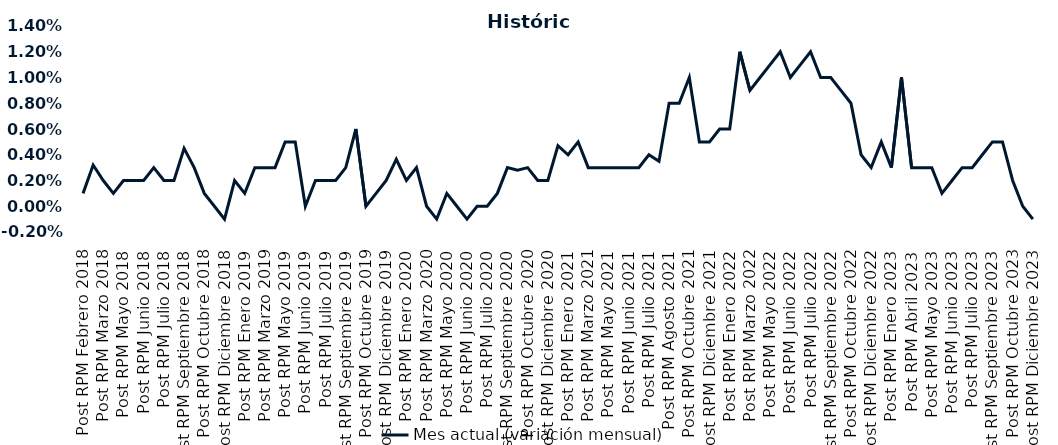
| Category | Mes actual (variación mensual)  |
|---|---|
| Post RPM Febrero 2018 | 0.001 |
| Pre RPM Marzo 2018 | 0.003 |
| Post RPM Marzo 2018 | 0.002 |
| Pre RPM Mayo 2018 | 0.001 |
| Post RPM Mayo 2018 | 0.002 |
| Pre RPM Junio 2018 | 0.002 |
| Post RPM Junio 2018 | 0.002 |
| Pre RPM Julio 2018 | 0.003 |
| Post RPM Julio 2018 | 0.002 |
| Pre RPM Septiembre 2018 | 0.002 |
| Post RPM Septiembre 2018 | 0.004 |
| Pre RPM Octubre 2018 | 0.003 |
| Post RPM Octubre 2018 | 0.001 |
| Pre RPM Diciembre 2018 | 0 |
| Post RPM Diciembre 2018 | -0.001 |
| Pre RPM Enero 2019 | 0.002 |
| Post RPM Enero 2019 | 0.001 |
| Pre RPM Marzo 2019 | 0.003 |
| Post RPM Marzo 2019 | 0.003 |
| Pre RPM Mayo 2019 | 0.003 |
| Post RPM Mayo 2019 | 0.005 |
| Pre RPM Junio 2019 | 0.005 |
| Post RPM Junio 2019 | 0 |
| Pre RPM Julio 2019 | 0.002 |
| Post RPM Julio 2019 | 0.002 |
| Pre RPM Septiembre 2019 | 0.002 |
| Post RPM Septiembre 2019 | 0.003 |
| Pre RPM Octubre 2019 | 0.006 |
| Post RPM Octubre 2019 | 0 |
| Pre RPM Diciembre 2019 | 0.001 |
| Post RPM Diciembre 2019 | 0.002 |
| Pre RPM Enero 2020 | 0.004 |
| Post RPM Enero 2020 | 0.002 |
| Pre RPM Marzo 2020 | 0.003 |
| Post RPM Marzo 2020 | 0 |
| Pre RPM Mayo 2020 | -0.001 |
| Post RPM Mayo 2020 | 0.001 |
| Pre RPM Junio 2020 | 0 |
| Post RPM Junio 2020 | -0.001 |
| Pre RPM Julio 2020 | 0 |
| Post RPM Julio 2020 | 0 |
| Pre RPM Septiembre 2020 | 0.001 |
| Post RPM Septiembre 2020 | 0.003 |
| Pre RPM Octubre 2020 | 0.003 |
| Post RPM Octubre 2020 | 0.003 |
| Pre RPM Diciembre 2020 | 0.002 |
| Post RPM Diciembre 2020 | 0.002 |
| Pre RPM Enero 2021 | 0.005 |
| Post RPM Enero 2021 | 0.004 |
| Pre RPM Marzo 2021 | 0.005 |
| Post RPM Marzo 2021 | 0.003 |
| Pre RPM Mayo 2021 | 0.003 |
| Post RPM Mayo 2021 | 0.003 |
| Pre RPM Junio 2021 | 0.003 |
| Post RPM Junio 2021 | 0.003 |
| Pre RPM Julio 2021 | 0.003 |
| Post RPM Julio 2021 | 0.004 |
| Pre RPM Agosto 2021 | 0.004 |
| Post RPM Agosto 2021 | 0.008 |
| Pre RPM Octubre 2021 | 0.008 |
| Post RPM Octubre 2021 | 0.01 |
| Pre RPM Diciembre 2021 | 0.005 |
| Post RPM Diciembre 2021 | 0.005 |
| Pre RPM Enero 2022 | 0.006 |
| Post RPM Enero 2022 | 0.006 |
| Pre RPM Marzo 2022 | 0.012 |
| Post RPM Marzo 2022 | 0.009 |
| Pre RPM Mayo 2022 | 0.01 |
| Post RPM Mayo 2022 | 0.011 |
| Pre RPM Junio 2022 | 0.012 |
| Post RPM Junio 2022 | 0.01 |
| Pre RPM Julio 2022 | 0.011 |
| Post RPM Julio 2022 | 0.012 |
| Pre RPM Septiembre 2022 | 0.01 |
| Post RPM Septiembre 2022 | 0.01 |
| Pre RPM Octubre 2022 | 0.009 |
| Post RPM Octubre 2022 | 0.008 |
| Pre RPM Diciembre 2022 | 0.004 |
| Post RPM Diciembre 2022 | 0.003 |
| Pre RPM Enero 2023 | 0.005 |
| Post RPM Enero 2023 | 0.003 |
| Pre RPM Abril 2023 | 0.01 |
| Post RPM Abril 2023 | 0.003 |
| Pre RPM Mayo 2023 | 0.003 |
| Post RPM Mayo 2023 | 0.003 |
| Pre RPM Junio 2023 | 0.001 |
| Post RPM Junio 2023 | 0.002 |
| Pre RPM Julio 2023 | 0.003 |
| Post RPM Julio 2023 | 0.003 |
| Pre RPM Septiembre 2023 | 0.004 |
| Post RPM Septiembre 2023 | 0.005 |
| Pre RPM Octubre 2023 | 0.005 |
| Post RPM Octubre 2023 | 0.002 |
| Pre RPM Diciembre 2023 | 0 |
| Post RPM Diciembre 2023 | -0.001 |